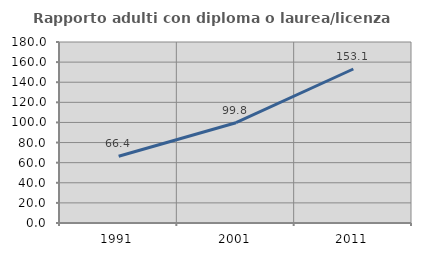
| Category | Rapporto adulti con diploma o laurea/licenza media  |
|---|---|
| 1991.0 | 66.446 |
| 2001.0 | 99.75 |
| 2011.0 | 153.149 |